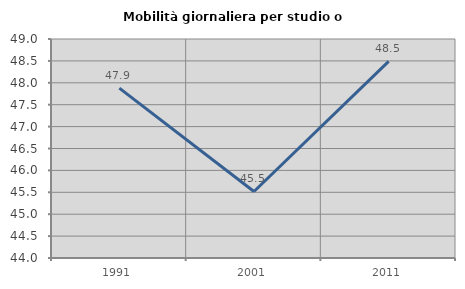
| Category | Mobilità giornaliera per studio o lavoro |
|---|---|
| 1991.0 | 47.877 |
| 2001.0 | 45.519 |
| 2011.0 | 48.487 |